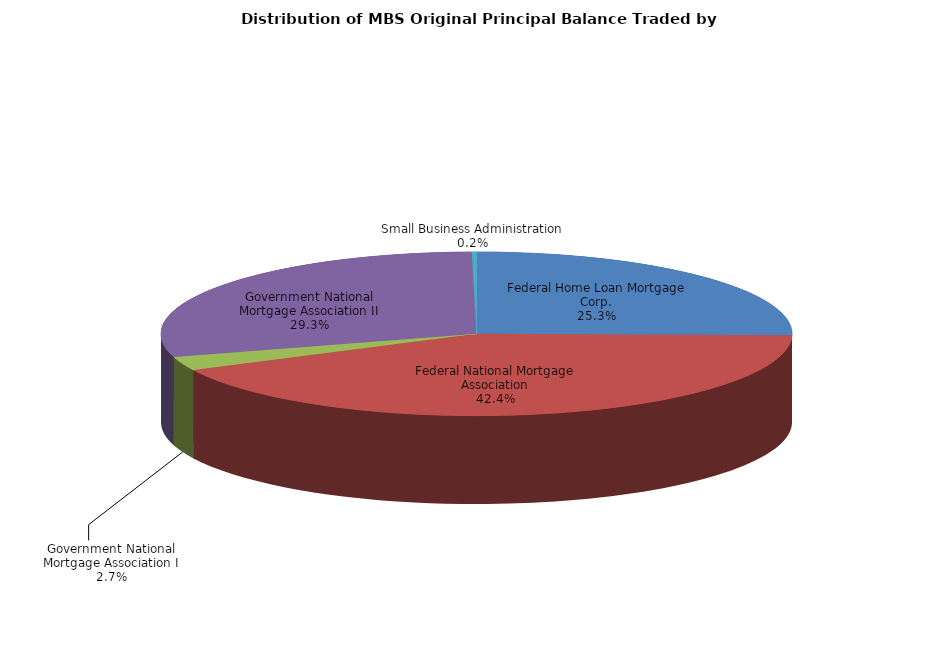
| Category | Series 0 |
|---|---|
| Federal Home Loan Mortgage Corp. | 4972324491.824 |
| Federal National Mortgage Association | 8346827518.859 |
| Government National Mortgage Association I | 534899820.986 |
| Government National Mortgage Association II | 5770349149.238 |
| Small Business Administration | 46896831.407 |